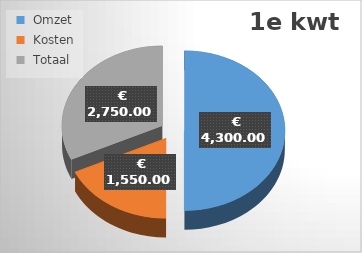
| Category | 1e |
|---|---|
|  Omzet  | 4300 |
|  Kosten  | 1550 |
|  Totaal  | 2750 |